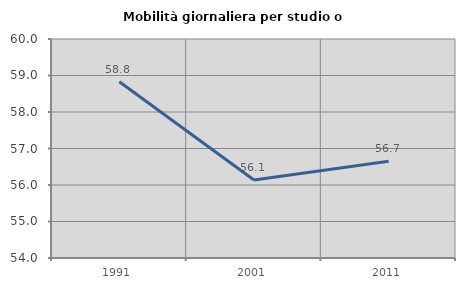
| Category | Mobilità giornaliera per studio o lavoro |
|---|---|
| 1991.0 | 58.827 |
| 2001.0 | 56.139 |
| 2011.0 | 56.653 |